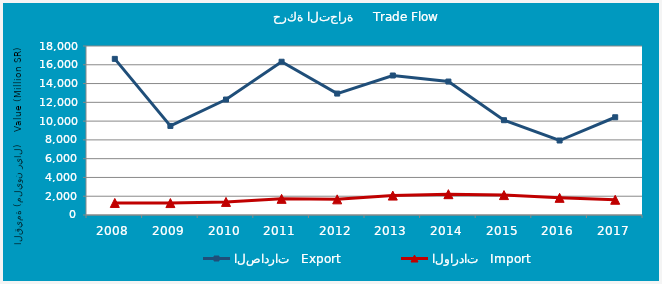
| Category | الصادرات   Export | الواردات   Import |
|---|---|---|
| 2008.0 | 16629502325 | 1282980645 |
| 2009.0 | 9487486601 | 1271380619 |
| 2010.0 | 12298437724 | 1394308105 |
| 2011.0 | 16322874172 | 1719174884 |
| 2012.0 | 12932542816 | 1666150490 |
| 2013.0 | 14856420980 | 2067720484 |
| 2014.0 | 14212495367 | 2217222689 |
| 2015.0 | 10096599626 | 2118833846 |
| 2016.0 | 7933962487 | 1828387179 |
| 2017.0 | 10410366204 | 1623375591 |